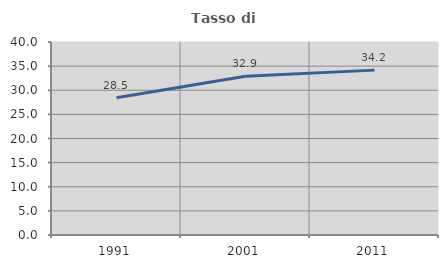
| Category | Tasso di occupazione   |
|---|---|
| 1991.0 | 28.463 |
| 2001.0 | 32.893 |
| 2011.0 | 34.171 |